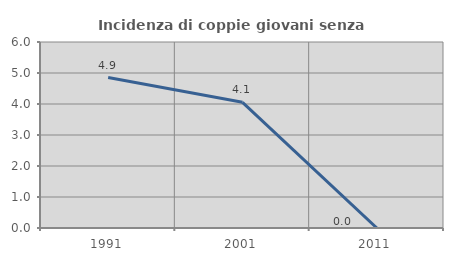
| Category | Incidenza di coppie giovani senza figli |
|---|---|
| 1991.0 | 4.854 |
| 2001.0 | 4.054 |
| 2011.0 | 0 |